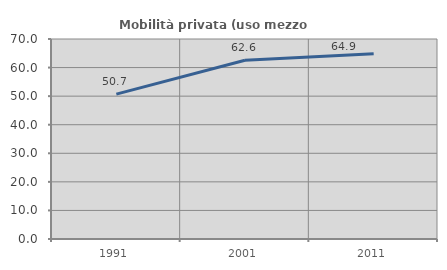
| Category | Mobilità privata (uso mezzo privato) |
|---|---|
| 1991.0 | 50.719 |
| 2001.0 | 62.575 |
| 2011.0 | 64.877 |